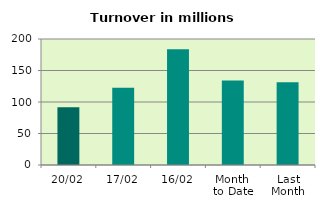
| Category | Series 0 |
|---|---|
| 20/02 | 91.571 |
| 17/02 | 122.527 |
| 16/02 | 183.745 |
| Month 
to Date | 134.201 |
| Last
Month | 131.402 |